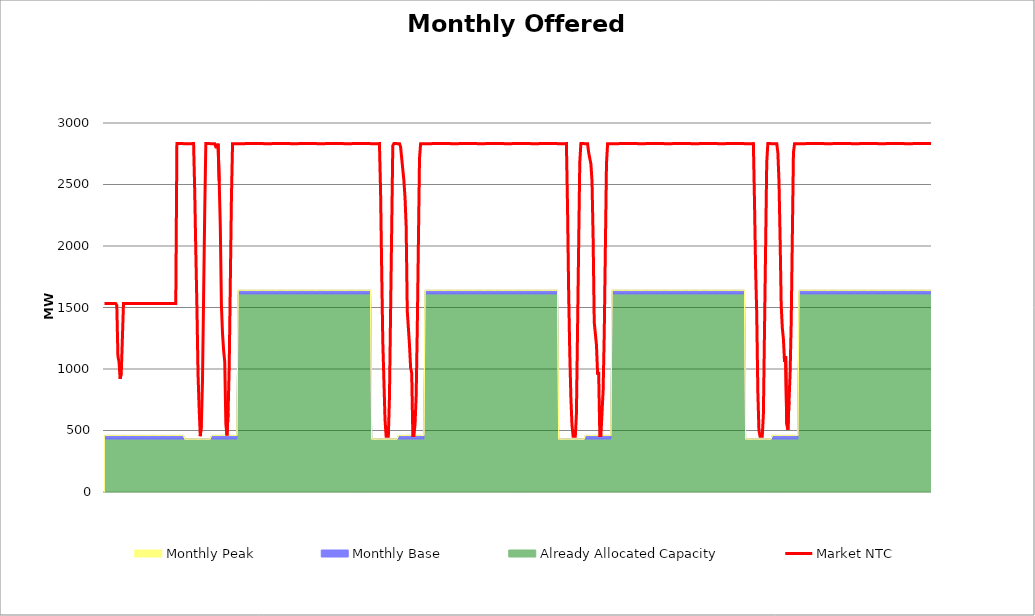
| Category | Market NTC |
|---|---|
| 0 | 1532 |
| 1 | 1532 |
| 2 | 1532 |
| 3 | 1532 |
| 4 | 1532 |
| 5 | 1532 |
| 6 | 1532 |
| 7 | 1532 |
| 8 | 1532 |
| 9 | 1532 |
| 10 | 1532 |
| 11 | 1518 |
| 12 | 1104 |
| 13 | 1058 |
| 14 | 920 |
| 15 | 966 |
| 16 | 1242 |
| 17 | 1532 |
| 18 | 1532 |
| 19 | 1532 |
| 20 | 1532 |
| 21 | 1532 |
| 22 | 1532 |
| 23 | 1532 |
| 24 | 1532 |
| 25 | 1532 |
| 26 | 1532 |
| 27 | 1532 |
| 28 | 1532 |
| 29 | 1532 |
| 30 | 1532 |
| 31 | 1533 |
| 32 | 1533 |
| 33 | 1533 |
| 34 | 1533 |
| 35 | 1533 |
| 36 | 1533 |
| 37 | 1533 |
| 38 | 1533 |
| 39 | 1533 |
| 40 | 1533 |
| 41 | 1533 |
| 42 | 1533 |
| 43 | 1533 |
| 44 | 1533 |
| 45 | 1533 |
| 46 | 1533 |
| 47 | 1532 |
| 48 | 1532 |
| 49 | 1532 |
| 50 | 1532 |
| 51 | 1532 |
| 52 | 1532 |
| 53 | 1532 |
| 54 | 1532 |
| 55 | 1533 |
| 56 | 1533 |
| 57 | 1533 |
| 58 | 1533 |
| 59 | 1533 |
| 60 | 1533 |
| 61 | 1533 |
| 62 | 1533 |
| 63 | 1533 |
| 64 | 1533 |
| 65 | 2833 |
| 66 | 2833 |
| 67 | 2833 |
| 68 | 2833 |
| 69 | 2833 |
| 70 | 2833 |
| 71 | 2832 |
| 72 | 2832 |
| 73 | 2832 |
| 74 | 2832 |
| 75 | 2832 |
| 76 | 2832 |
| 77 | 2832 |
| 78 | 2832 |
| 79 | 2833 |
| 80 | 2833 |
| 81 | 2452 |
| 82 | 1953 |
| 83 | 1499 |
| 84 | 954 |
| 85 | 681 |
| 86 | 454 |
| 87 | 545 |
| 88 | 908 |
| 89 | 1589 |
| 90 | 2271 |
| 91 | 2833 |
| 92 | 2833 |
| 93 | 2833 |
| 94 | 2833 |
| 95 | 2832 |
| 96 | 2832 |
| 97 | 2832 |
| 98 | 2832 |
| 99 | 2832 |
| 100 | 2805 |
| 101 | 2805 |
| 102 | 2832 |
| 103 | 2529 |
| 104 | 2161 |
| 105 | 1518 |
| 106 | 1288 |
| 107 | 1150 |
| 108 | 1058 |
| 109 | 552 |
| 110 | 460 |
| 111 | 644 |
| 112 | 1012 |
| 113 | 1702 |
| 114 | 2391 |
| 115 | 2832 |
| 116 | 2832 |
| 117 | 2832 |
| 118 | 2832 |
| 119 | 2832 |
| 120 | 2832 |
| 121 | 2832 |
| 122 | 2832 |
| 123 | 2832 |
| 124 | 2832 |
| 125 | 2832 |
| 126 | 2832 |
| 127 | 2833 |
| 128 | 2833 |
| 129 | 2833 |
| 130 | 2833 |
| 131 | 2833 |
| 132 | 2833 |
| 133 | 2833 |
| 134 | 2833 |
| 135 | 2833 |
| 136 | 2833 |
| 137 | 2833 |
| 138 | 2833 |
| 139 | 2833 |
| 140 | 2833 |
| 141 | 2833 |
| 142 | 2833 |
| 143 | 2832 |
| 144 | 2832 |
| 145 | 2832 |
| 146 | 2832 |
| 147 | 2832 |
| 148 | 2832 |
| 149 | 2832 |
| 150 | 2832 |
| 151 | 2833 |
| 152 | 2833 |
| 153 | 2833 |
| 154 | 2833 |
| 155 | 2833 |
| 156 | 2833 |
| 157 | 2833 |
| 158 | 2833 |
| 159 | 2833 |
| 160 | 2833 |
| 161 | 2833 |
| 162 | 2833 |
| 163 | 2833 |
| 164 | 2833 |
| 165 | 2833 |
| 166 | 2833 |
| 167 | 2832 |
| 168 | 2832 |
| 169 | 2832 |
| 170 | 2832 |
| 171 | 2832 |
| 172 | 2832 |
| 173 | 2832 |
| 174 | 2832 |
| 175 | 2833 |
| 176 | 2833 |
| 177 | 2833 |
| 178 | 2833 |
| 179 | 2833 |
| 180 | 2833 |
| 181 | 2833 |
| 182 | 2833 |
| 183 | 2833 |
| 184 | 2833 |
| 185 | 2833 |
| 186 | 2833 |
| 187 | 2833 |
| 188 | 2833 |
| 189 | 2833 |
| 190 | 2833 |
| 191 | 2832 |
| 192 | 2832 |
| 193 | 2832 |
| 194 | 2832 |
| 195 | 2832 |
| 196 | 2832 |
| 197 | 2832 |
| 198 | 2832 |
| 199 | 2833 |
| 200 | 2833 |
| 201 | 2833 |
| 202 | 2833 |
| 203 | 2833 |
| 204 | 2833 |
| 205 | 2833 |
| 206 | 2833 |
| 207 | 2833 |
| 208 | 2833 |
| 209 | 2833 |
| 210 | 2833 |
| 211 | 2833 |
| 212 | 2833 |
| 213 | 2833 |
| 214 | 2833 |
| 215 | 2832 |
| 216 | 2832 |
| 217 | 2832 |
| 218 | 2832 |
| 219 | 2832 |
| 220 | 2832 |
| 221 | 2832 |
| 222 | 2832 |
| 223 | 2833 |
| 224 | 2833 |
| 225 | 2833 |
| 226 | 2833 |
| 227 | 2833 |
| 228 | 2833 |
| 229 | 2833 |
| 230 | 2833 |
| 231 | 2833 |
| 232 | 2833 |
| 233 | 2833 |
| 234 | 2833 |
| 235 | 2833 |
| 236 | 2833 |
| 237 | 2833 |
| 238 | 2833 |
| 239 | 2832 |
| 240 | 2832 |
| 241 | 2832 |
| 242 | 2832 |
| 243 | 2832 |
| 244 | 2832 |
| 245 | 2832 |
| 246 | 2832 |
| 247 | 2833 |
| 248 | 2452 |
| 249 | 1817 |
| 250 | 1226 |
| 251 | 908 |
| 252 | 590 |
| 253 | 454 |
| 254 | 454 |
| 255 | 454 |
| 256 | 772 |
| 257 | 1453 |
| 258 | 2134 |
| 259 | 2816 |
| 260 | 2833 |
| 261 | 2833 |
| 262 | 2833 |
| 263 | 2832 |
| 264 | 2832 |
| 265 | 2832 |
| 266 | 2805 |
| 267 | 2713 |
| 268 | 2621 |
| 269 | 2529 |
| 270 | 2391 |
| 271 | 2161 |
| 272 | 1472 |
| 273 | 1334 |
| 274 | 1196 |
| 275 | 1012 |
| 276 | 966 |
| 277 | 460 |
| 278 | 460 |
| 279 | 552 |
| 280 | 782 |
| 281 | 1334 |
| 282 | 2023 |
| 283 | 2713 |
| 284 | 2832 |
| 285 | 2832 |
| 286 | 2832 |
| 287 | 2832 |
| 288 | 2832 |
| 289 | 2832 |
| 290 | 2832 |
| 291 | 2832 |
| 292 | 2832 |
| 293 | 2832 |
| 294 | 2832 |
| 295 | 2833 |
| 296 | 2833 |
| 297 | 2833 |
| 298 | 2833 |
| 299 | 2833 |
| 300 | 2833 |
| 301 | 2833 |
| 302 | 2833 |
| 303 | 2833 |
| 304 | 2833 |
| 305 | 2833 |
| 306 | 2833 |
| 307 | 2833 |
| 308 | 2833 |
| 309 | 2833 |
| 310 | 2833 |
| 311 | 2832 |
| 312 | 2832 |
| 313 | 2832 |
| 314 | 2832 |
| 315 | 2832 |
| 316 | 2832 |
| 317 | 2832 |
| 318 | 2832 |
| 319 | 2833 |
| 320 | 2833 |
| 321 | 2833 |
| 322 | 2833 |
| 323 | 2833 |
| 324 | 2833 |
| 325 | 2833 |
| 326 | 2833 |
| 327 | 2833 |
| 328 | 2833 |
| 329 | 2833 |
| 330 | 2833 |
| 331 | 2833 |
| 332 | 2833 |
| 333 | 2833 |
| 334 | 2833 |
| 335 | 2832 |
| 336 | 2832 |
| 337 | 2832 |
| 338 | 2832 |
| 339 | 2832 |
| 340 | 2832 |
| 341 | 2832 |
| 342 | 2832 |
| 343 | 2833 |
| 344 | 2833 |
| 345 | 2833 |
| 346 | 2833 |
| 347 | 2833 |
| 348 | 2833 |
| 349 | 2833 |
| 350 | 2833 |
| 351 | 2833 |
| 352 | 2833 |
| 353 | 2833 |
| 354 | 2833 |
| 355 | 2833 |
| 356 | 2833 |
| 357 | 2833 |
| 358 | 2833 |
| 359 | 2832 |
| 360 | 2832 |
| 361 | 2832 |
| 362 | 2832 |
| 363 | 2832 |
| 364 | 2832 |
| 365 | 2832 |
| 366 | 2832 |
| 367 | 2833 |
| 368 | 2833 |
| 369 | 2833 |
| 370 | 2833 |
| 371 | 2833 |
| 372 | 2833 |
| 373 | 2833 |
| 374 | 2833 |
| 375 | 2833 |
| 376 | 2833 |
| 377 | 2833 |
| 378 | 2833 |
| 379 | 2833 |
| 380 | 2833 |
| 381 | 2833 |
| 382 | 2833 |
| 383 | 2832 |
| 384 | 2832 |
| 385 | 2832 |
| 386 | 2832 |
| 387 | 2832 |
| 388 | 2832 |
| 389 | 2832 |
| 390 | 2832 |
| 391 | 2833 |
| 392 | 2833 |
| 393 | 2833 |
| 394 | 2833 |
| 395 | 2833 |
| 396 | 2833 |
| 397 | 2833 |
| 398 | 2833 |
| 399 | 2833 |
| 400 | 2833 |
| 401 | 2833 |
| 402 | 2833 |
| 403 | 2833 |
| 404 | 2833 |
| 405 | 2833 |
| 406 | 2833 |
| 407 | 2832 |
| 408 | 2832 |
| 409 | 2832 |
| 410 | 2832 |
| 411 | 2832 |
| 412 | 2832 |
| 413 | 2832 |
| 414 | 2832 |
| 415 | 2833 |
| 416 | 2316 |
| 417 | 1635 |
| 418 | 1135 |
| 419 | 772 |
| 420 | 545 |
| 421 | 454 |
| 422 | 454 |
| 423 | 454 |
| 424 | 636 |
| 425 | 1317 |
| 426 | 1998 |
| 427 | 2679 |
| 428 | 2833 |
| 429 | 2833 |
| 430 | 2833 |
| 431 | 2832 |
| 432 | 2832 |
| 433 | 2832 |
| 434 | 2832 |
| 435 | 2759 |
| 436 | 2713 |
| 437 | 2667 |
| 438 | 2529 |
| 439 | 2069 |
| 440 | 1380 |
| 441 | 1288 |
| 442 | 1196 |
| 443 | 966 |
| 444 | 966 |
| 445 | 460 |
| 446 | 460 |
| 447 | 644 |
| 448 | 828 |
| 449 | 1288 |
| 450 | 1977 |
| 451 | 2667 |
| 452 | 2832 |
| 453 | 2832 |
| 454 | 2832 |
| 455 | 2832 |
| 456 | 2832 |
| 457 | 2832 |
| 458 | 2832 |
| 459 | 2832 |
| 460 | 2832 |
| 461 | 2832 |
| 462 | 2832 |
| 463 | 2833 |
| 464 | 2833 |
| 465 | 2833 |
| 466 | 2833 |
| 467 | 2833 |
| 468 | 2833 |
| 469 | 2833 |
| 470 | 2833 |
| 471 | 2833 |
| 472 | 2833 |
| 473 | 2833 |
| 474 | 2833 |
| 475 | 2833 |
| 476 | 2833 |
| 477 | 2833 |
| 478 | 2833 |
| 479 | 2832 |
| 480 | 2832 |
| 481 | 2832 |
| 482 | 2832 |
| 483 | 2832 |
| 484 | 2832 |
| 485 | 2832 |
| 486 | 2832 |
| 487 | 2833 |
| 488 | 2833 |
| 489 | 2833 |
| 490 | 2833 |
| 491 | 2833 |
| 492 | 2833 |
| 493 | 2833 |
| 494 | 2833 |
| 495 | 2833 |
| 496 | 2833 |
| 497 | 2833 |
| 498 | 2833 |
| 499 | 2833 |
| 500 | 2833 |
| 501 | 2833 |
| 502 | 2833 |
| 503 | 2832 |
| 504 | 2832 |
| 505 | 2832 |
| 506 | 2832 |
| 507 | 2832 |
| 508 | 2832 |
| 509 | 2832 |
| 510 | 2832 |
| 511 | 2833 |
| 512 | 2833 |
| 513 | 2833 |
| 514 | 2833 |
| 515 | 2833 |
| 516 | 2833 |
| 517 | 2833 |
| 518 | 2833 |
| 519 | 2833 |
| 520 | 2833 |
| 521 | 2833 |
| 522 | 2833 |
| 523 | 2833 |
| 524 | 2833 |
| 525 | 2833 |
| 526 | 2833 |
| 527 | 2832 |
| 528 | 2832 |
| 529 | 2832 |
| 530 | 2832 |
| 531 | 2832 |
| 532 | 2832 |
| 533 | 2832 |
| 534 | 2832 |
| 535 | 2833 |
| 536 | 2833 |
| 537 | 2833 |
| 538 | 2833 |
| 539 | 2833 |
| 540 | 2833 |
| 541 | 2833 |
| 542 | 2833 |
| 543 | 2833 |
| 544 | 2833 |
| 545 | 2833 |
| 546 | 2833 |
| 547 | 2833 |
| 548 | 2833 |
| 549 | 2833 |
| 550 | 2833 |
| 551 | 2832 |
| 552 | 2832 |
| 553 | 2832 |
| 554 | 2832 |
| 555 | 2832 |
| 556 | 2832 |
| 557 | 2832 |
| 558 | 2832 |
| 559 | 2833 |
| 560 | 2833 |
| 561 | 2833 |
| 562 | 2833 |
| 563 | 2833 |
| 564 | 2833 |
| 565 | 2833 |
| 566 | 2833 |
| 567 | 2833 |
| 568 | 2833 |
| 569 | 2833 |
| 570 | 2833 |
| 571 | 2833 |
| 572 | 2833 |
| 573 | 2833 |
| 574 | 2833 |
| 575 | 2832 |
| 576 | 2832 |
| 577 | 2832 |
| 578 | 2832 |
| 579 | 2832 |
| 580 | 2832 |
| 581 | 2832 |
| 582 | 2832 |
| 583 | 2833 |
| 584 | 2361 |
| 585 | 1817 |
| 586 | 1453 |
| 587 | 817 |
| 588 | 500 |
| 589 | 454 |
| 590 | 454 |
| 591 | 454 |
| 592 | 636 |
| 593 | 1317 |
| 594 | 1998 |
| 595 | 2679 |
| 596 | 2833 |
| 597 | 2833 |
| 598 | 2833 |
| 599 | 2832 |
| 600 | 2832 |
| 601 | 2832 |
| 602 | 2832 |
| 603 | 2832 |
| 604 | 2832 |
| 605 | 2759 |
| 606 | 2529 |
| 607 | 2069 |
| 608 | 1518 |
| 609 | 1334 |
| 610 | 1242 |
| 611 | 1058 |
| 612 | 1104 |
| 613 | 552 |
| 614 | 506 |
| 615 | 736 |
| 616 | 966 |
| 617 | 1380 |
| 618 | 2069 |
| 619 | 2759 |
| 620 | 2832 |
| 621 | 2832 |
| 622 | 2832 |
| 623 | 2832 |
| 624 | 2832 |
| 625 | 2832 |
| 626 | 2832 |
| 627 | 2832 |
| 628 | 2832 |
| 629 | 2832 |
| 630 | 2832 |
| 631 | 2833 |
| 632 | 2833 |
| 633 | 2833 |
| 634 | 2833 |
| 635 | 2833 |
| 636 | 2833 |
| 637 | 2833 |
| 638 | 2833 |
| 639 | 2833 |
| 640 | 2833 |
| 641 | 2833 |
| 642 | 2833 |
| 643 | 2833 |
| 644 | 2833 |
| 645 | 2833 |
| 646 | 2833 |
| 647 | 2832 |
| 648 | 2832 |
| 649 | 2832 |
| 650 | 2832 |
| 651 | 2832 |
| 652 | 2832 |
| 653 | 2832 |
| 654 | 2832 |
| 655 | 2833 |
| 656 | 2833 |
| 657 | 2833 |
| 658 | 2833 |
| 659 | 2833 |
| 660 | 2833 |
| 661 | 2833 |
| 662 | 2833 |
| 663 | 2833 |
| 664 | 2833 |
| 665 | 2833 |
| 666 | 2833 |
| 667 | 2833 |
| 668 | 2833 |
| 669 | 2833 |
| 670 | 2833 |
| 671 | 2832 |
| 672 | 2832 |
| 673 | 2832 |
| 674 | 2832 |
| 675 | 2832 |
| 676 | 2832 |
| 677 | 2832 |
| 678 | 2832 |
| 679 | 2833 |
| 680 | 2833 |
| 681 | 2833 |
| 682 | 2833 |
| 683 | 2833 |
| 684 | 2833 |
| 685 | 2833 |
| 686 | 2833 |
| 687 | 2833 |
| 688 | 2833 |
| 689 | 2833 |
| 690 | 2833 |
| 691 | 2833 |
| 692 | 2833 |
| 693 | 2833 |
| 694 | 2833 |
| 695 | 2832 |
| 696 | 2832 |
| 697 | 2832 |
| 698 | 2832 |
| 699 | 2832 |
| 700 | 2832 |
| 701 | 2832 |
| 702 | 2832 |
| 703 | 2833 |
| 704 | 2833 |
| 705 | 2833 |
| 706 | 2833 |
| 707 | 2833 |
| 708 | 2833 |
| 709 | 2833 |
| 710 | 2833 |
| 711 | 2833 |
| 712 | 2833 |
| 713 | 2833 |
| 714 | 2833 |
| 715 | 2833 |
| 716 | 2833 |
| 717 | 2833 |
| 718 | 2833 |
| 719 | 2832 |
| 720 | 2832 |
| 721 | 2832 |
| 722 | 2832 |
| 723 | 2832 |
| 724 | 2832 |
| 725 | 2832 |
| 726 | 2832 |
| 727 | 2833 |
| 728 | 2833 |
| 729 | 2833 |
| 730 | 2833 |
| 731 | 2833 |
| 732 | 2833 |
| 733 | 2833 |
| 734 | 2833 |
| 735 | 2833 |
| 736 | 2833 |
| 737 | 2833 |
| 738 | 2833 |
| 739 | 2833 |
| 740 | 2833 |
| 741 | 2833 |
| 742 | 2833 |
| 743 | 2832 |